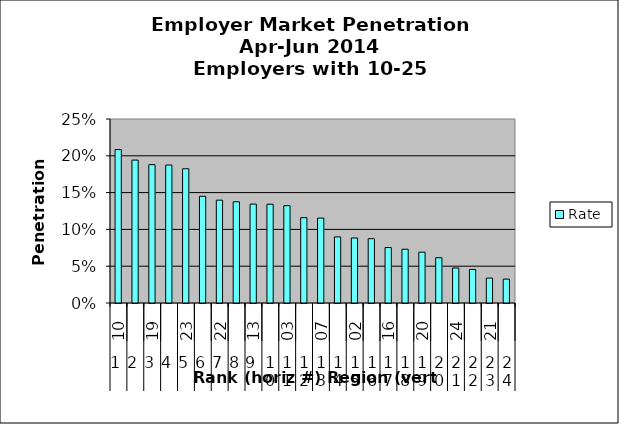
| Category | Rate |
|---|---|
| 0 | 0.208 |
| 1 | 0.194 |
| 2 | 0.188 |
| 3 | 0.187 |
| 4 | 0.182 |
| 5 | 0.145 |
| 6 | 0.14 |
| 7 | 0.138 |
| 8 | 0.134 |
| 9 | 0.134 |
| 10 | 0.132 |
| 11 | 0.116 |
| 12 | 0.115 |
| 13 | 0.09 |
| 14 | 0.088 |
| 15 | 0.087 |
| 16 | 0.075 |
| 17 | 0.073 |
| 18 | 0.069 |
| 19 | 0.061 |
| 20 | 0.048 |
| 21 | 0.046 |
| 22 | 0.034 |
| 23 | 0.032 |